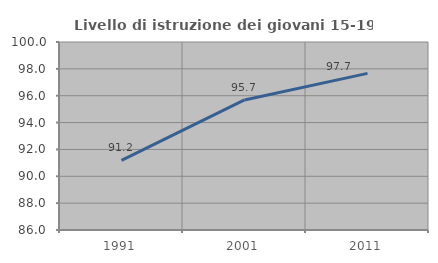
| Category | Livello di istruzione dei giovani 15-19 anni |
|---|---|
| 1991.0 | 91.191 |
| 2001.0 | 95.685 |
| 2011.0 | 97.664 |